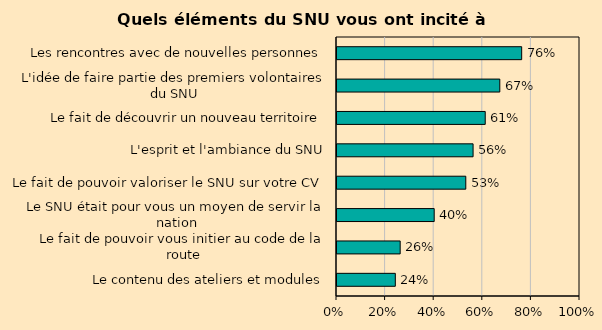
| Category | Series 0 |
|---|---|
| Le contenu des ateliers et modules | 0.24 |
| Le fait de pouvoir vous initier au code de la route | 0.26 |
| Le SNU était pour vous un moyen de servir la nation | 0.4 |
| Le fait de pouvoir valoriser le SNU sur votre CV | 0.53 |
| L'esprit et l'ambiance du SNU | 0.56 |
| Le fait de découvrir un nouveau territoire | 0.61 |
| L'idée de faire partie des premiers volontaires du SNU | 0.67 |
| Les rencontres avec de nouvelles personnes | 0.76 |